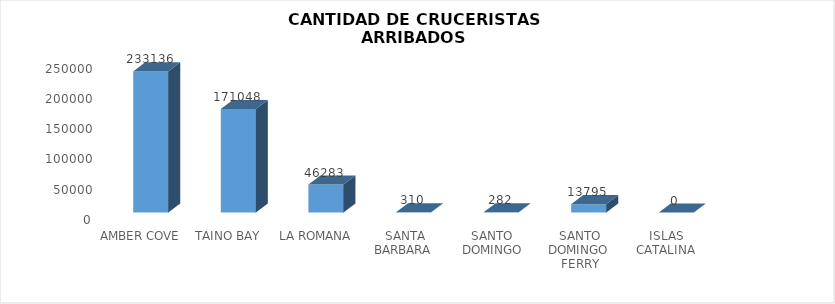
| Category | Series 0 |
|---|---|
| AMBER COVE | 233136 |
| TAINO BAY | 171048 |
| LA ROMANA | 46283 |
| SANTA BARBARA  | 310 |
| SANTO DOMINGO | 282 |
| SANTO DOMINGO  FERRY | 13795 |
| ISLAS  CATALINA  | 0 |